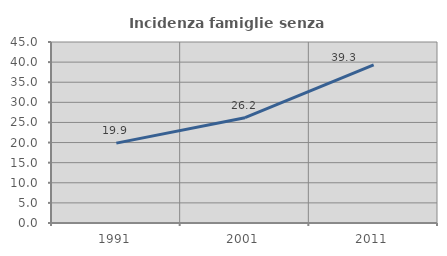
| Category | Incidenza famiglie senza nuclei |
|---|---|
| 1991.0 | 19.858 |
| 2001.0 | 26.175 |
| 2011.0 | 39.296 |